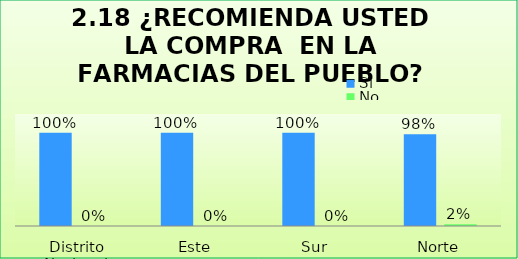
| Category | Si  | No |
|---|---|---|
| Distrito Nacional | 1 | 0 |
| Este | 1 | 0 |
| Sur  | 1 | 0 |
| Norte | 0.982 | 0.018 |